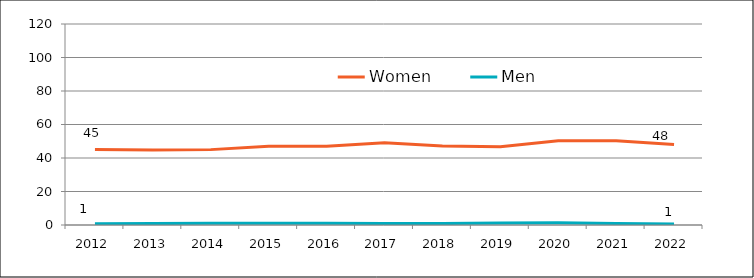
| Category | Women | Men |
|---|---|---|
| 2012.0 | 45.027 | 0.713 |
| 2013.0 | 44.808 | 0.86 |
| 2014.0 | 45 | 1 |
| 2015.0 | 47 | 1 |
| 2016.0 | 47 | 1 |
| 2017.0 | 49.041 | 0.877 |
| 2018.0 | 47.223 | 0.853 |
| 2019.0 | 46.75 | 1.212 |
| 2020.0 | 50.356 | 1.28 |
| 2021.0 | 50.323 | 0.902 |
| 2022.0 | 48.078 | 0.586 |